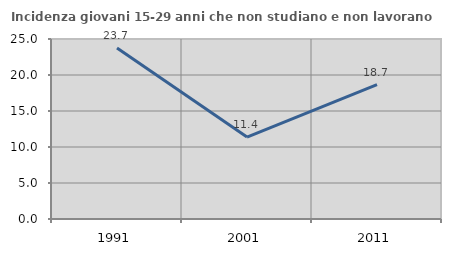
| Category | Incidenza giovani 15-29 anni che non studiano e non lavorano  |
|---|---|
| 1991.0 | 23.741 |
| 2001.0 | 11.382 |
| 2011.0 | 18.664 |